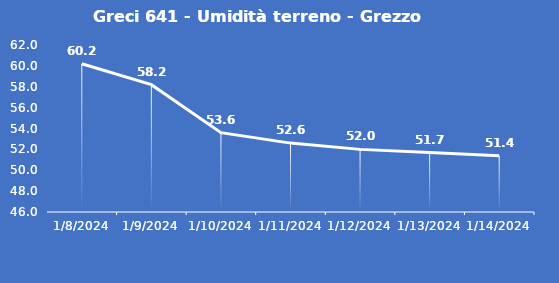
| Category | Greci 641 - Umidità terreno - Grezzo (%VWC) |
|---|---|
| 1/8/24 | 60.2 |
| 1/9/24 | 58.2 |
| 1/10/24 | 53.6 |
| 1/11/24 | 52.6 |
| 1/12/24 | 52 |
| 1/13/24 | 51.7 |
| 1/14/24 | 51.4 |